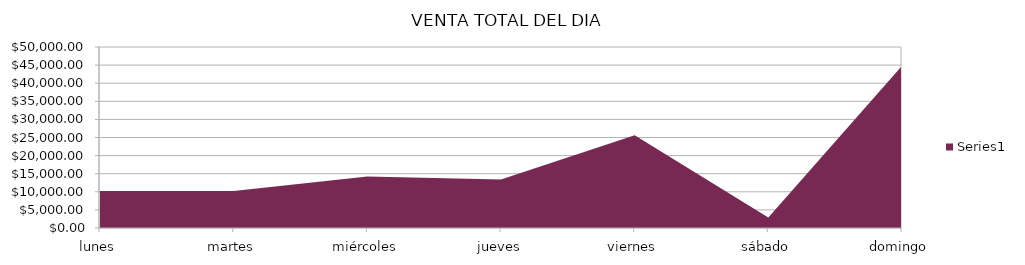
| Category | Series 0 |
|---|---|
| lunes | 10250 |
| martes | 10250 |
| miércoles | 14200 |
| jueves | 13400 |
| viernes | 25600 |
| sábado | 2900 |
| domingo | 44800 |